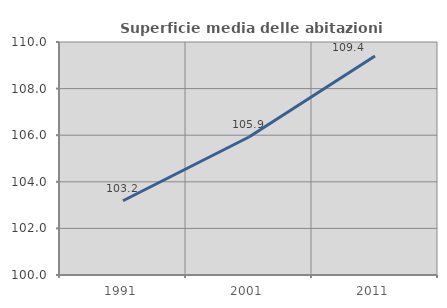
| Category | Superficie media delle abitazioni occupate |
|---|---|
| 1991.0 | 103.187 |
| 2001.0 | 105.923 |
| 2011.0 | 109.401 |